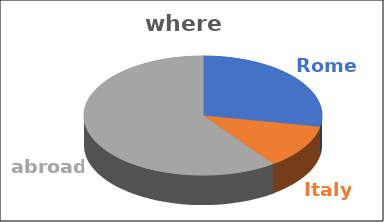
| Category | where | Series 1 | Series 2 | Series 3 | Series 4 |
|---|---|---|---|---|---|
| Rome | 0.28 |  |  |  |  |
| Italy | 0.12 |  |  |  |  |
| abroad | 0.6 |  |  |  |  |